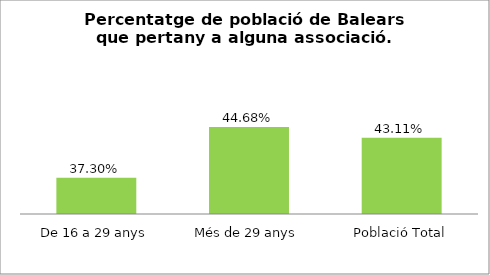
| Category | Series 0 |
|---|---|
| De 16 a 29 anys | 0.373 |
| Més de 29 anys | 0.447 |
| Població Total | 0.431 |